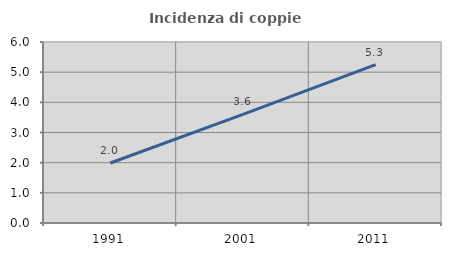
| Category | Incidenza di coppie miste |
|---|---|
| 1991.0 | 1.989 |
| 2001.0 | 3.604 |
| 2011.0 | 5.253 |